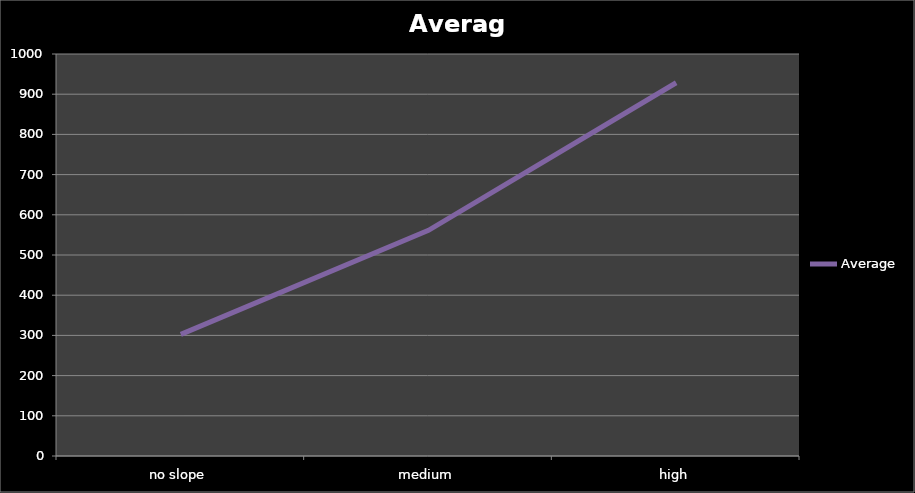
| Category | Average |
|---|---|
| no slope | 302.592 |
| medium | 561.429 |
| high | 928.429 |